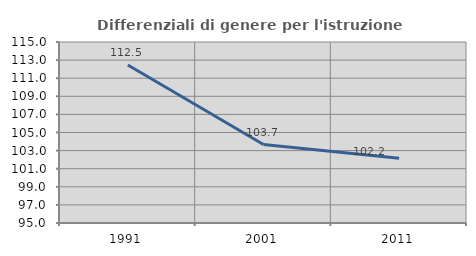
| Category | Differenziali di genere per l'istruzione superiore |
|---|---|
| 1991.0 | 112.458 |
| 2001.0 | 103.673 |
| 2011.0 | 102.152 |